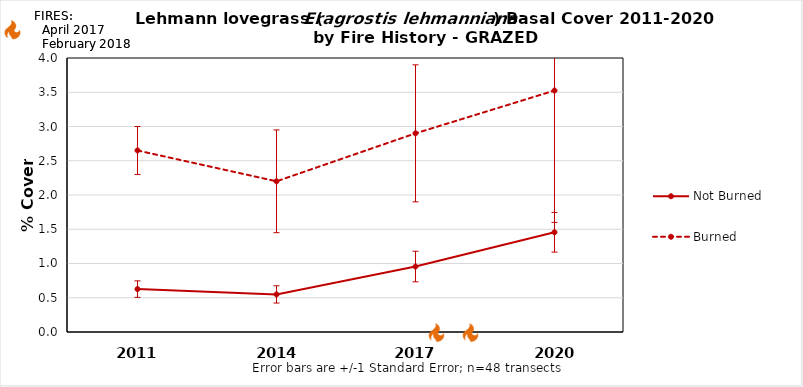
| Category | Not Burned | Burned |
|---|---|---|
| 2011.0 | 0.626 | 2.65 |
| 2014.0 | 0.549 | 2.2 |
| 2017.0 | 0.956 | 2.9 |
| 2020.0 | 1.456 | 3.525 |